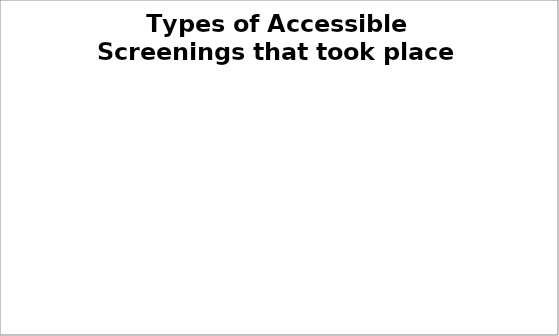
| Category | Series 0 |
|---|---|
| CPD beneficiaries | 0 |
| Industry event Attendees | 0 |